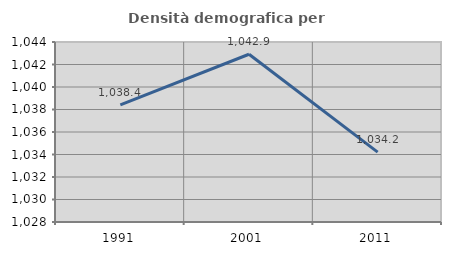
| Category | Densità demografica |
|---|---|
| 1991.0 | 1038.407 |
| 2001.0 | 1042.91 |
| 2011.0 | 1034.211 |